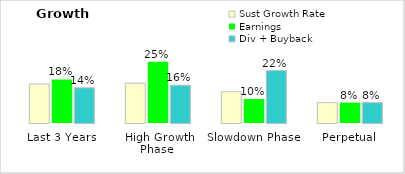
| Category | Sust Growth Rate | Earnings | Div + Buyback |
|---|---|---|---|
| Last 3 Years | 0.16 | 0.179 | 0.145 |
| High Growth Phase  | 0.164 | 0.251 | 0.155 |
| Slowdown Phase | 0.128 | 0.099 | 0.215 |
| Perpetual | 0.084 | 0.084 | 0.084 |